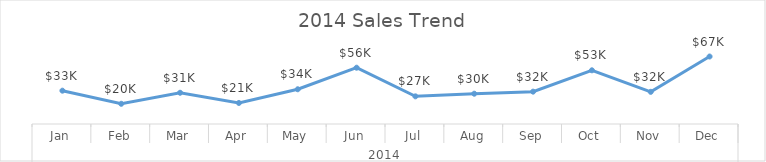
| Category | Total |
|---|---|
| 0 | 32907.84 |
| 1 | 19955.5 |
| 2 | 30852.6 |
| 3 | 20771.79 |
| 4 | 34307.05 |
| 5 | 55601.61 |
| 6 | 27318.54 |
| 7 | 29921.46 |
| 8 | 31949.97 |
| 9 | 53033.59 |
| 10 | 31773.43 |
| 11 | 66642.78 |